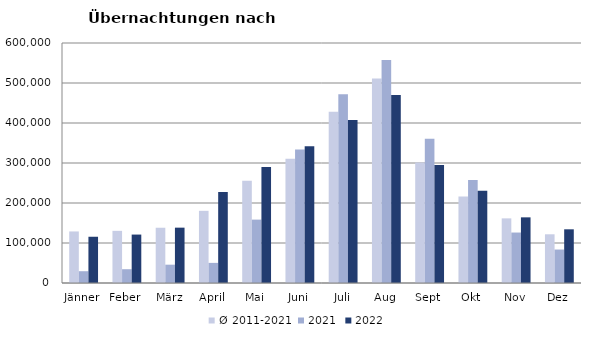
| Category | Ø 2011-2021 | 2021 | 2022 |
|---|---|---|---|
| Jänner | 128876.636 | 29476 | 115620 |
| Feber | 130386.364 | 34472 | 121086 |
| März | 138154.364 | 45792 | 138364 |
| April | 180434.727 | 50285 | 227240 |
| Mai | 255705.636 | 158476 | 290079 |
| Juni | 310539.182 | 333648 | 341645 |
| Juli | 428074.636 | 472159 | 407558 |
| Aug | 510964.091 | 557336 | 470298 |
| Sept | 301237.455 | 360851 | 294755 |
| Okt | 216113.909 | 257755 | 230442 |
| Nov | 161561.636 | 126150 | 164130 |
| Dez | 121777.091 | 83661 | 134236 |